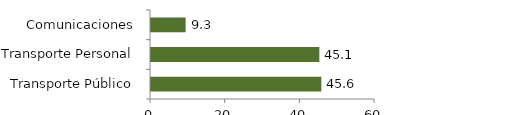
| Category | Transporte y comunicaciones |
|---|---|
| Transporte Público | 45.631 |
| Transporte Personal | 45.095 |
| Comunicaciones | 9.275 |